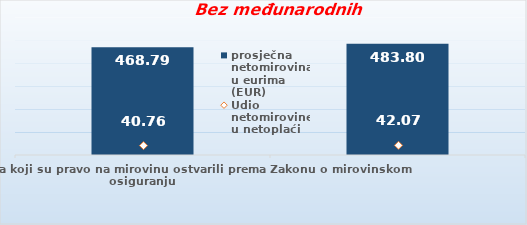
| Category | prosječna netomirovina u eurima (EUR) |
|---|---|
| Korisnici mirovina koji su pravo na mirovinu ostvarili prema Zakonu o mirovinskom osiguranju  | 468.79 |
| Korisnici koji su pravo na mirovinu PRVI PUT ostvarili u 2023. godini prema Zakonu o mirovinskom osiguranju - NOVI KORISNICI | 483.804 |